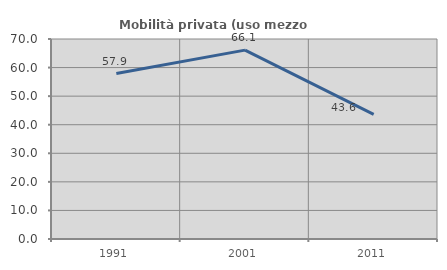
| Category | Mobilità privata (uso mezzo privato) |
|---|---|
| 1991.0 | 57.895 |
| 2001.0 | 66.102 |
| 2011.0 | 43.636 |